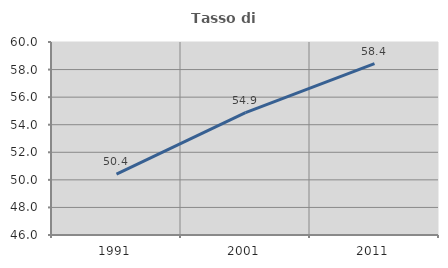
| Category | Tasso di occupazione   |
|---|---|
| 1991.0 | 50.413 |
| 2001.0 | 54.884 |
| 2011.0 | 58.431 |